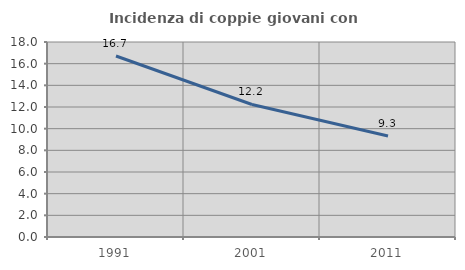
| Category | Incidenza di coppie giovani con figli |
|---|---|
| 1991.0 | 16.71 |
| 2001.0 | 12.234 |
| 2011.0 | 9.329 |